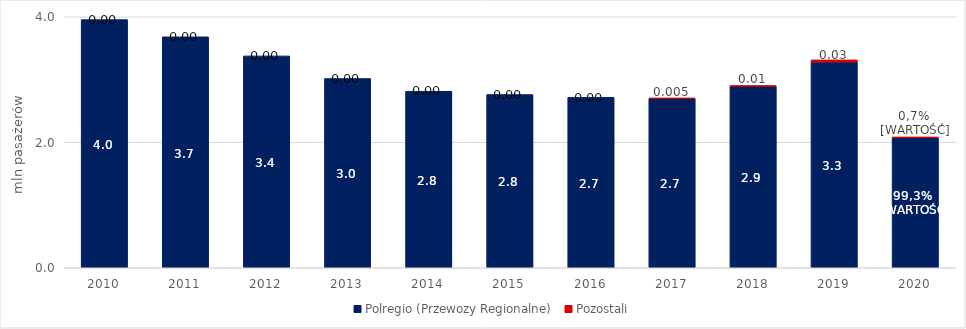
| Category | Polregio (Przewozy Regionalne) | Pozostali |
|---|---|---|
| 2010 | 3.955 | 0 |
| 2011 | 3.68 | 0 |
| 2012 | 3.376 | 0 |
| 2013 | 3.016 | 0 |
| 2014 | 2.813 | 0 |
| 2015 | 2.761 | 0 |
| 2016 | 2.716 | 0 |
| 2017 | 2.698 | 0.005 |
| 2018 | 2.895 | 0.006 |
| 2019 | 3.279 | 0.034 |
| 2020 | 2.07 | 0.015 |